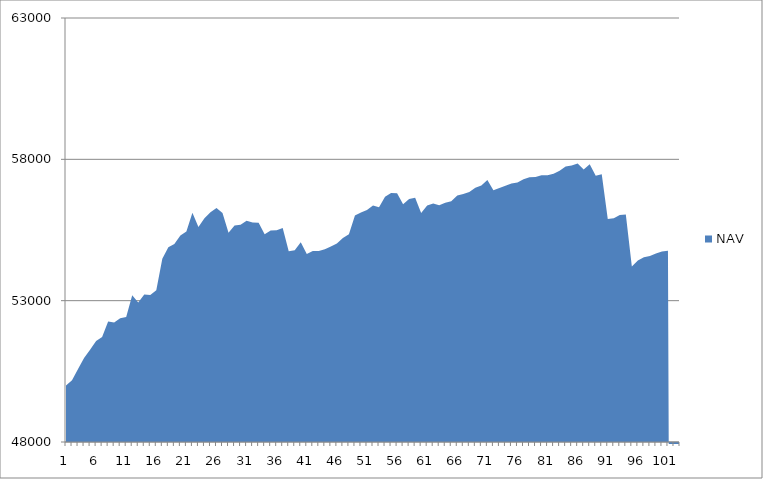
| Category | NAV |
|---|---|
| 0 | 50000 |
| 1 | 50185.185 |
| 2 | 50585.185 |
| 3 | 50973.977 |
| 4 | 51265.977 |
| 5 | 51576.741 |
| 6 | 51711.523 |
| 7 | 52262.893 |
| 8 | 52230.24 |
| 9 | 52381.556 |
| 10 | 52425.915 |
| 11 | 53192.581 |
| 12 | 52939.146 |
| 13 | 53220.069 |
| 14 | 53197.341 |
| 15 | 53369.61 |
| 16 | 54480.721 |
| 17 | 54888.365 |
| 18 | 55001.902 |
| 19 | 55308.308 |
| 20 | 55448.308 |
| 21 | 56110.305 |
| 22 | 55610.305 |
| 23 | 55916.954 |
| 24 | 56129.798 |
| 25 | 56279.798 |
| 26 | 56105.301 |
| 27 | 55401.645 |
| 28 | 55657.201 |
| 29 | 55686.925 |
| 30 | 55823.001 |
| 31 | 55769.596 |
| 32 | 55759.375 |
| 33 | 55350.284 |
| 34 | 55480.284 |
| 35 | 55492.498 |
| 36 | 55570.42 |
| 37 | 54746.89 |
| 38 | 54783.7 |
| 39 | 55066.459 |
| 40 | 54651.074 |
| 41 | 54754.078 |
| 42 | 54760.213 |
| 43 | 54816.924 |
| 44 | 54917.296 |
| 45 | 55025.73 |
| 46 | 55220.535 |
| 47 | 55353.465 |
| 48 | 56009.309 |
| 49 | 56118.959 |
| 50 | 56205.212 |
| 51 | 56362.876 |
| 52 | 56307.394 |
| 53 | 56678.935 |
| 54 | 56813.264 |
| 55 | 56799.502 |
| 56 | 56409.112 |
| 57 | 56596.44 |
| 58 | 56640.493 |
| 59 | 56102.227 |
| 60 | 56370.449 |
| 61 | 56434.248 |
| 62 | 56376.841 |
| 63 | 56464.524 |
| 64 | 56518.022 |
| 65 | 56724.747 |
| 66 | 56770.361 |
| 67 | 56848.099 |
| 68 | 56992.896 |
| 69 | 57073.571 |
| 70 | 57266.481 |
| 71 | 56908.016 |
| 72 | 56984.939 |
| 73 | 57069.276 |
| 74 | 57147.627 |
| 75 | 57179.83 |
| 76 | 57291.17 |
| 77 | 57366.35 |
| 78 | 57371.599 |
| 79 | 57439.215 |
| 80 | 57440.895 |
| 81 | 57490.895 |
| 82 | 57593.679 |
| 83 | 57746.643 |
| 84 | 57785.413 |
| 85 | 57849.748 |
| 86 | 57639.346 |
| 87 | 57828.82 |
| 88 | 57417.055 |
| 89 | 57471.335 |
| 90 | 55888.376 |
| 91 | 55913.907 |
| 92 | 56031.989 |
| 93 | 56044.711 |
| 94 | 54210.631 |
| 95 | 54422.612 |
| 96 | 54536.647 |
| 97 | 54575.903 |
| 98 | 54670.229 |
| 99 | 54737.367 |
| 100 | 54762.386 |
| 101 | 80.577 |
| 102 | 119.038 |